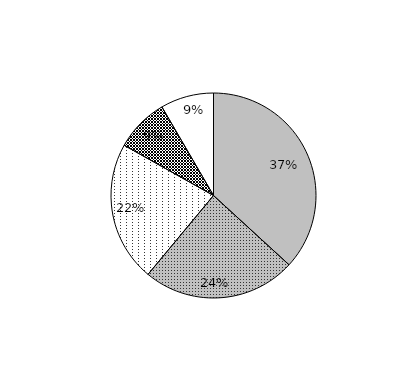
| Category | Series 0 | Data C |
|---|---|---|
| 0 | 63.841 | 0 |
| 1 | 41.986 | 0 |
| 2 | 38.368 | 0 |
| 3 | 14.65 | 0 |
| 4 | 14.562 | 0 |